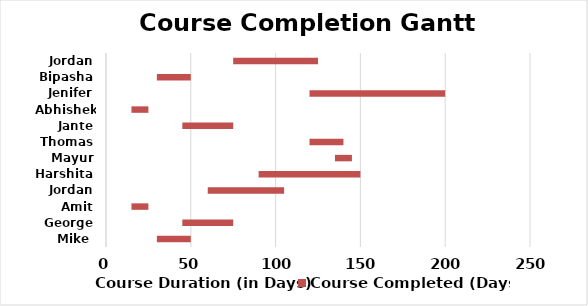
| Category | Course Duration (in Days) | Course Completed (Days) |
|---|---|---|
| Mike  | 30 | 20 |
| George | 45 | 30 |
| Amit | 15 | 10 |
| Jordan | 60 | 45 |
| Harshita | 90 | 60 |
| Mayur | 135 | 10 |
| Thomas | 120 | 20 |
| Jante | 45 | 30 |
| Abhishek  | 15 | 10 |
| Jenifer | 120 | 80 |
| Bipasha | 30 | 20 |
| Jordan | 75 | 50 |